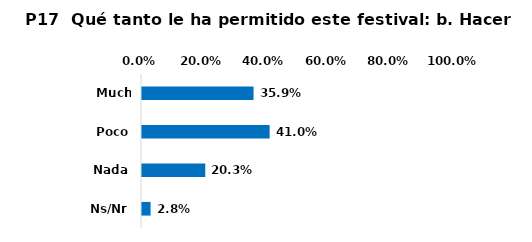
| Category | Series 0 |
|---|---|
| Mucho | 0.359 |
| Poco | 0.41 |
| Nada | 0.203 |
| Ns/Nr | 0.028 |